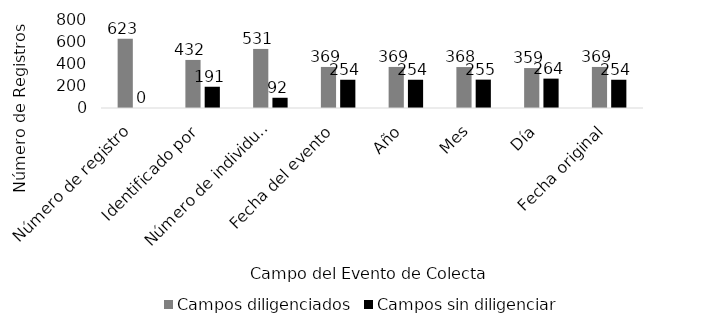
| Category | Campos diligenciados | Campos sin diligenciar |
|---|---|---|
| Número de registro | 623 | 0 |
| Identificado por | 432 | 191 |
| Número de individuos | 531 | 92 |
| Fecha del evento | 369 | 254 |
| Año | 369 | 254 |
| Mes | 368 | 255 |
| Día | 359 | 264 |
| Fecha original | 369 | 254 |